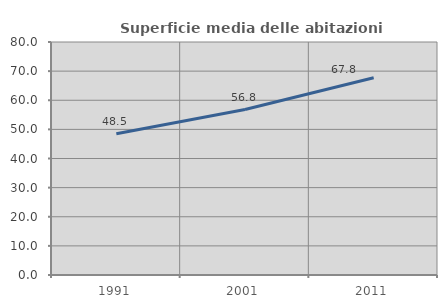
| Category | Superficie media delle abitazioni occupate |
|---|---|
| 1991.0 | 48.488 |
| 2001.0 | 56.81 |
| 2011.0 | 67.75 |